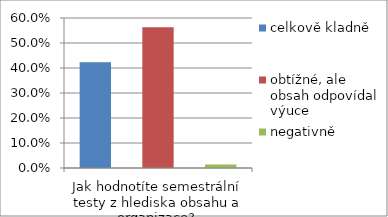
| Category | celkově kladně  | obtížné, ale obsah odpovídal výuce | negativně |
|---|---|---|---|
| Jak hodnotíte semestrální testy z hlediska obsahu a organizace? | 0.423 | 0.563 | 0.014 |